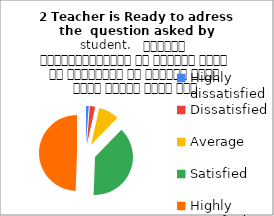
| Category | 2 Teacher is Ready to adress the  question asked by student.   शिक्षक विद्यार्थियों के द्वारा पूछे गए प्रश्नों का समाधान करने हेतु तत्पर रहते हैं |
|---|---|
| Highly dissatisfied | 2 |
| Dissatisfied | 4 |
| Average | 15 |
| Satisfied | 66 |
| Highly satisfied | 85 |